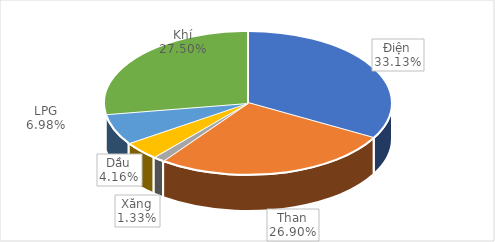
| Category | Series 0 |
|---|---|
| Điện | 1681675.106 |
| Than | 1365487.27 |
| Xăng | 67266.105 |
| Dầu | 211268.455 |
| LPG | 354480.535 |
| Khí | 1395973.17 |